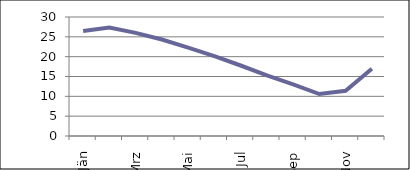
| Category | Series 0 |
|---|---|
| Jän | 26.462 |
| Feb | 27.373 |
| Mrz | 25.989 |
| Apr | 24.329 |
| Mai | 22.3 |
| Jun | 20.115 |
| Jul | 17.772 |
| Aug | 15.274 |
| Sep | 13.005 |
| Okt | 10.586 |
| Nov | 11.415 |
| Dez | 16.969 |